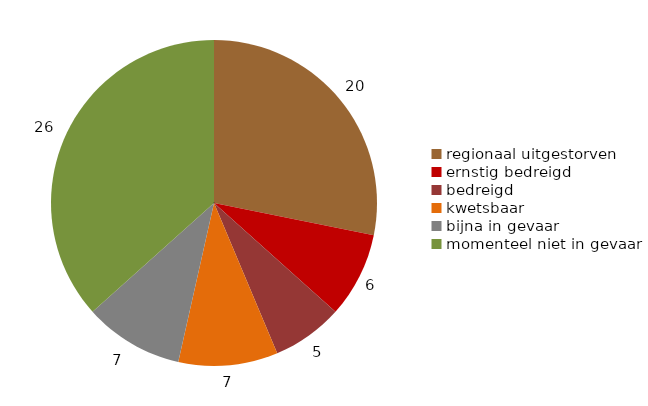
| Category | Series 0 |
|---|---|
| regionaal uitgestorven | 20 |
| ernstig bedreigd | 6 |
| bedreigd | 5 |
| kwetsbaar | 7 |
| bijna in gevaar | 7 |
| momenteel niet in gevaar | 26 |